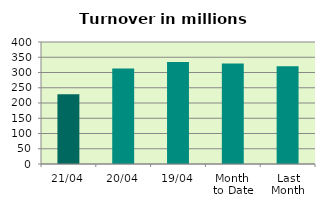
| Category | Series 0 |
|---|---|
| 21/04 | 228.875 |
| 20/04 | 313.427 |
| 19/04 | 334.378 |
| Month 
to Date | 329.647 |
| Last
Month | 320.663 |